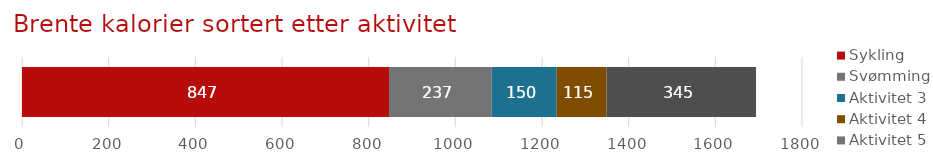
| Category | Sykling | Svømming | Aktivitet 3 | Aktivitet 4 | Aktivitet 5 |
|---|---|---|---|---|---|
| Aktivitetslogg | 847 | 237 | 150 | 115 | 345 |